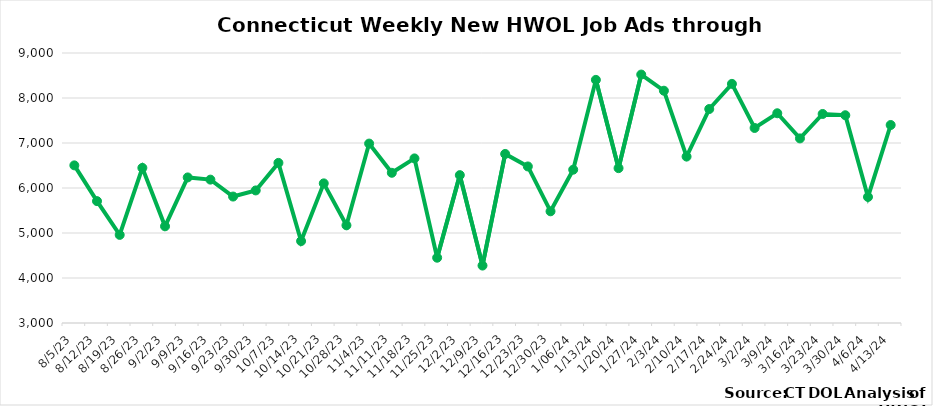
| Category | Connecticut |
|---|---|
| 8/5/23 | 6503 |
| 8/12/23 | 5708 |
| 8/19/23 | 4958 |
| 8/26/23 | 6447 |
| 9/2/23 | 5149 |
| 9/9/23 | 6235 |
| 9/16/23 | 6186 |
| 9/23/23 | 5810 |
| 9/30/23 | 5946 |
| 10/7/23 | 6558 |
| 10/14/23 | 4820 |
| 10/21/23 | 6103 |
| 10/28/23 | 5171 |
| 11/4/23 | 6987 |
| 11/11/23 | 6338 |
| 11/18/23 | 6658 |
| 11/25/23 | 4451 |
| 12/2/23 | 6286 |
| 12/9/23 | 4276 |
| 12/16/23 | 6757 |
|  12/23/23 | 6479 |
|  12/30/23 | 5482 |
|  1/06/24 | 6407 |
|  1/13/24 | 8403 |
|  1/20/24 | 6441 |
|  1/27/24 | 8521 |
|  2/3/24 | 8162 |
|  2/10/24 | 6698 |
|  2/17/24 | 7755 |
|  2/24/24 | 8314 |
|  3/2/24 | 7334 |
|  3/9/24 | 7661 |
|  3/16/24 | 7102 |
|  3/23/24 | 7645 |
|  3/30/24 | 7617 |
|  4/6/24 | 5801 |
|  4/13/24 | 7400 |